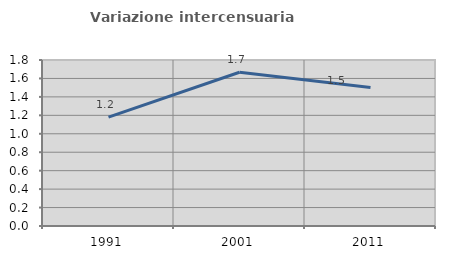
| Category | Variazione intercensuaria annua |
|---|---|
| 1991.0 | 1.18 |
| 2001.0 | 1.668 |
| 2011.0 | 1.502 |